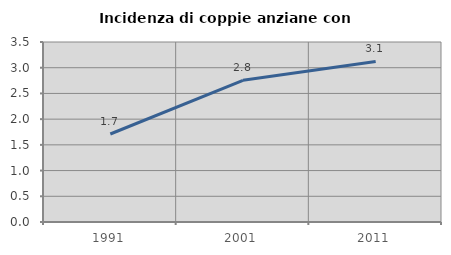
| Category | Incidenza di coppie anziane con figli |
|---|---|
| 1991.0 | 1.711 |
| 2001.0 | 2.755 |
| 2011.0 | 3.121 |